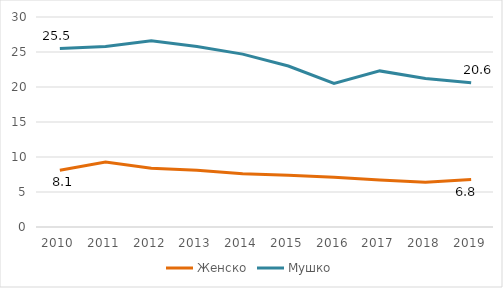
| Category | Женско | Мушко |
|---|---|---|
| 2010.0 | 8.1 | 25.5 |
| 2011.0 | 9.3 | 25.8 |
| 2012.0 | 8.4 | 26.6 |
| 2013.0 | 8.1 | 25.8 |
| 2014.0 | 7.6 | 24.7 |
| 2015.0 | 7.4 | 23 |
| 2016.0 | 7.1 | 20.5 |
| 2017.0 | 6.7 | 22.3 |
| 2018.0 | 6.4 | 21.2 |
| 2019.0 | 6.8 | 20.6 |